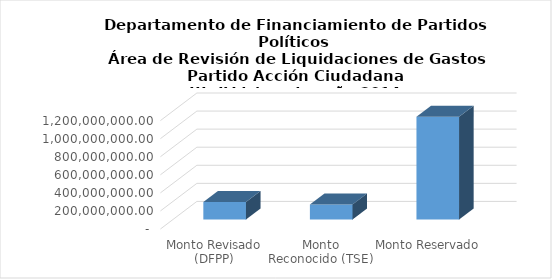
| Category | Series 0 |
|---|---|
| Monto Revisado (DFPP) | 193007007.2 |
| Monto Reconocido (TSE) | 167065795.85 |
| Monto Reservado  | 1136978424.83 |